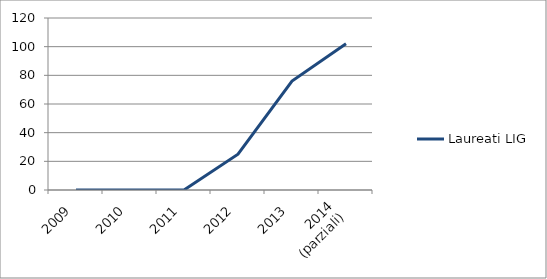
| Category | Laureati LIG |
|---|---|
| 2009 | 0 |
| 2010 | 0 |
| 2011 | 0 |
| 2012 | 25 |
| 2013 | 76 |
| 2014
(parziali) | 102 |